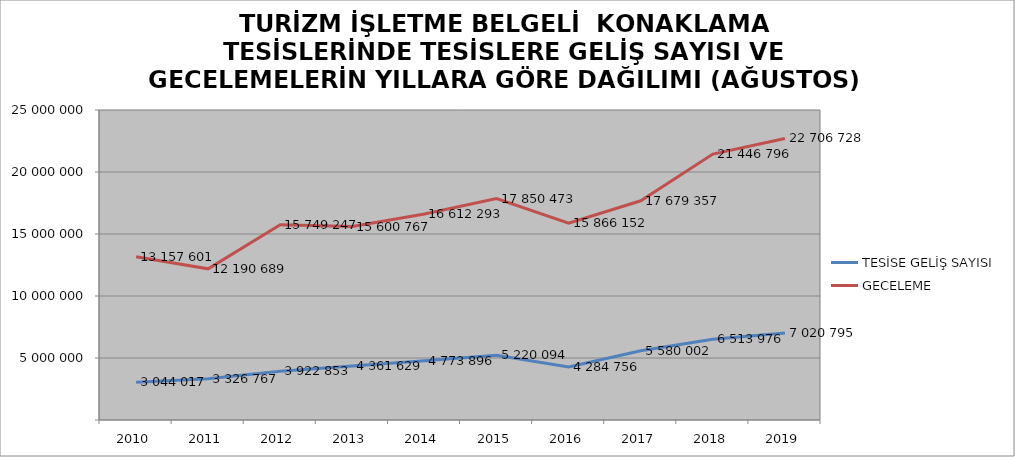
| Category | TESİSE GELİŞ SAYISI | GECELEME |
|---|---|---|
| 2010 | 3044017 | 13157601 |
| 2011 | 3326767 | 12190689 |
| 2012 | 3922853 | 15749247 |
| 2013 | 4361629 | 15600767 |
| 2014 | 4773896 | 16612293 |
| 2015 | 5220094 | 17850473 |
| 2016 | 4284756 | 15866152 |
| 2017 | 5580002 | 17679357 |
| 2018 | 6513976 | 21446796 |
| 2019 | 7020795 | 22706728 |